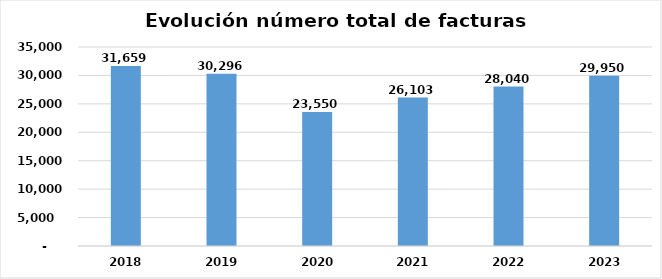
| Category | Número total de facturas |
|---|---|
| 2018.0 | 31659 |
| 2019.0 | 30296 |
| 2020.0 | 23550 |
| 2021.0 | 26103 |
| 2022.0 | 28040 |
| 2023.0 | 29950 |